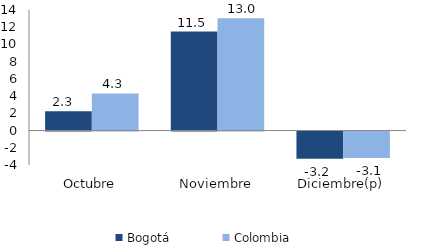
| Category | Bogotá | Colombia |
|---|---|---|
| Octubre | 2.254 | 4.317 |
| Noviembre | 11.491 | 13.037 |
| Diciembre(p) | -3.171 | -3.066 |